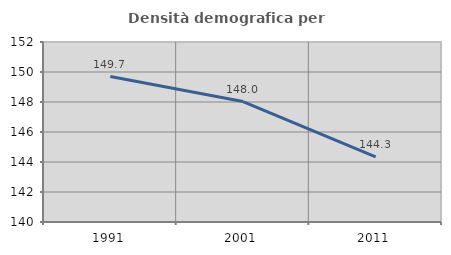
| Category | Densità demografica |
|---|---|
| 1991.0 | 149.7 |
| 2001.0 | 148.03 |
| 2011.0 | 144.339 |